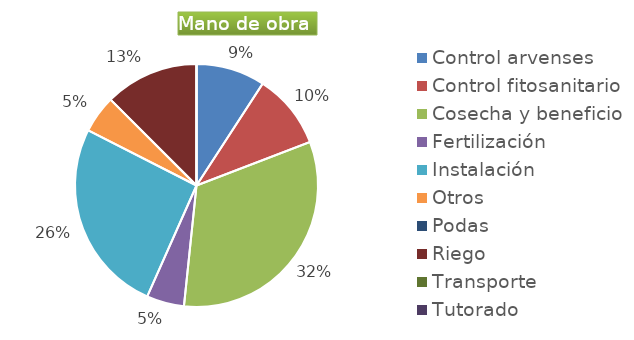
| Category | Series 0 |
|---|---|
| Control arvenses | 584419 |
| Control fitosanitario | 637548 |
| Cosecha y beneficio | 2070000 |
| Fertilización | 318774 |
| Instalación | 1646999 |
| Otros | 318774 |
| Podas | 0 |
| Riego | 796935 |
| Transporte | 0 |
| Tutorado | 0 |